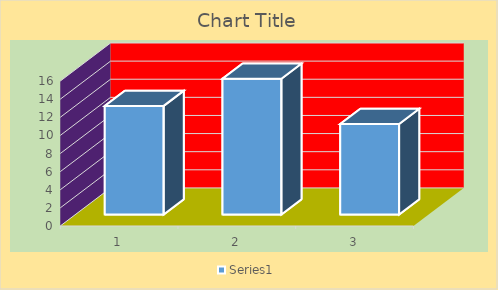
| Category | Series 0 |
|---|---|
| 0 | 12 |
| 1 | 15 |
| 2 | 10 |